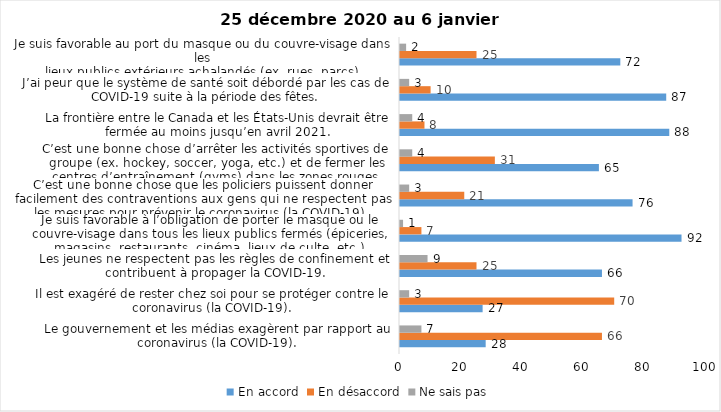
| Category | En accord | En désaccord | Ne sais pas |
|---|---|---|---|
| Le gouvernement et les médias exagèrent par rapport au coronavirus (la COVID-19). | 28 | 66 | 7 |
| Il est exagéré de rester chez soi pour se protéger contre le coronavirus (la COVID-19). | 27 | 70 | 3 |
| Les jeunes ne respectent pas les règles de confinement et contribuent à propager la COVID-19. | 66 | 25 | 9 |
| Je suis favorable à l’obligation de porter le masque ou le couvre-visage dans tous les lieux publics fermés (épiceries, magasins, restaurants, cinéma, lieux de culte, etc.). | 92 | 7 | 1 |
| C’est une bonne chose que les policiers puissent donner facilement des contraventions aux gens qui ne respectent pas les mesures pour prévenir le coronavirus (la COVID-19). | 76 | 21 | 3 |
| C’est une bonne chose d’arrêter les activités sportives de groupe (ex. hockey, soccer, yoga, etc.) et de fermer les centres d’entraînement (gyms) dans les zones rouges. | 65 | 31 | 4 |
| La frontière entre le Canada et les États-Unis devrait être fermée au moins jusqu’en avril 2021. | 88 | 8 | 4 |
| J’ai peur que le système de santé soit débordé par les cas de COVID-19 suite à la période des fêtes. | 87 | 10 | 3 |
| Je suis favorable au port du masque ou du couvre-visage dans les
lieux publics extérieurs achalandés (ex. rues, parcs) | 72 | 25 | 2 |